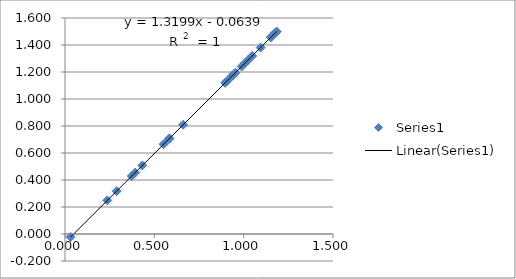
| Category | Series 0 |
|---|---|
| 0.03200000000000003 | -0.022 |
| 0.2370000000000001 | 0.249 |
| 0.2889999999999997 | 0.317 |
| 0.3930000000000007 | 0.455 |
| 0.37319999999999975 | 0.429 |
| 0.4330000000000007 | 0.508 |
| 0.5809999999999995 | 0.703 |
| 0.5519999999999996 | 0.665 |
| 0.585 | 0.708 |
| 0.6610000000000005 | 0.809 |
| 0.907 | 1.133 |
| 0.9340000000000002 | 1.169 |
| 0.9450000000000003 | 1.183 |
| 0.9370000000000003 | 1.173 |
| 0.8970000000000002 | 1.12 |
| 0.9539999999999997 | 1.195 |
| 0.9889999999999999 | 1.241 |
| 1.0060000000000002 | 1.264 |
| 1.024 | 1.288 |
| 1.048 | 1.319 |
| 1.0950000000000006 | 1.381 |
| 1.1559999999999997 | 1.462 |
| 1.1849999999999996 | 1.5 |
| 1.178 | 1.491 |
| 1.1740000000000004 | 1.486 |
| 1.1520000000000001 | 1.457 |